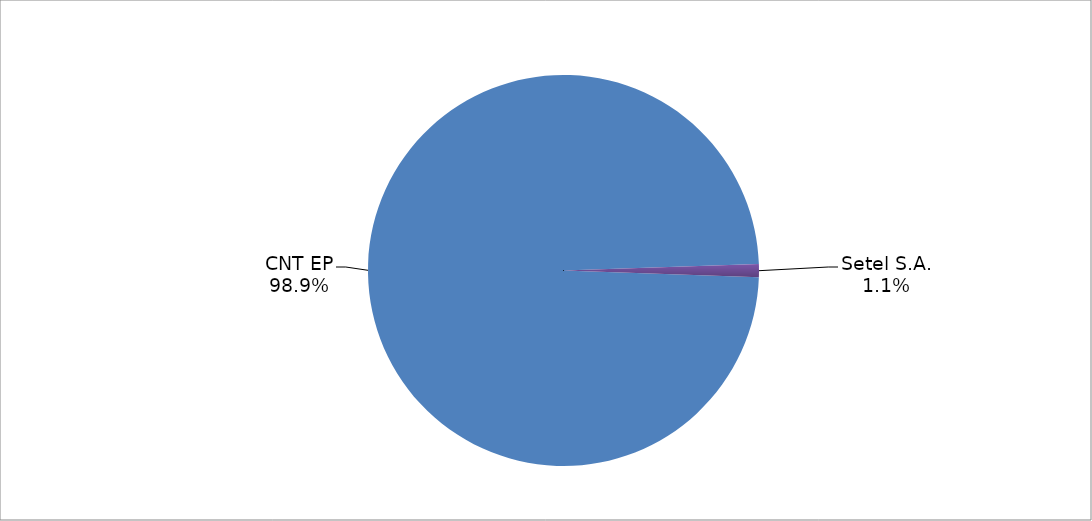
| Category | Series 0 |
|---|---|
| CNT EP | 275 |
| Setel S.A. | 3 |